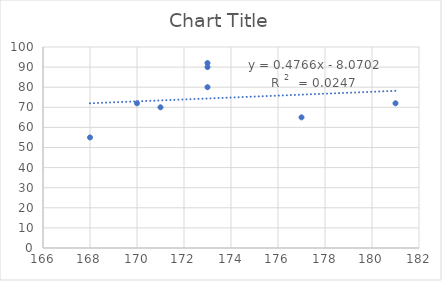
| Category | Series 0 |
|---|---|
| 173.0 | 90 |
| 173.0 | 92 |
| 177.0 | 65 |
| 171.0 | 70 |
| 170.0 | 72 |
| 181.0 | 72 |
| 173.0 | 80 |
| 168.0 | 55 |